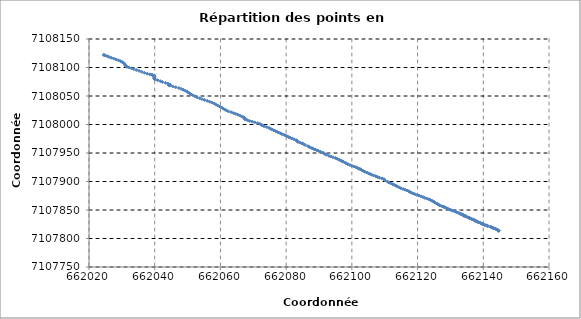
| Category | Series 0 |
|---|---|
| 662144.72 | 7107813.421 |
| 662144.589 | 7107813.587 |
| 662144.468 | 7107814.347 |
| 662144.363 | 7107814.971 |
| 662144.279 | 7107815.497 |
| 662144.242 | 7107815.692 |
| 662143.858 | 7107816.616 |
| 662143.619 | 7107817.131 |
| 662143.411 | 7107817.743 |
| 662143.033 | 7107818.399 |
| 662142.864 | 7107818.65 |
| 662142.582 | 7107819.428 |
| 662142.484 | 7107819.909 |
| 662142.165 | 7107820.459 |
| 662141.415 | 7107821.854 |
| 662141.141 | 7107822.362 |
| 662141.142 | 7107822.533 |
| 662140.944 | 7107823.171 |
| 662140.449 | 7107823.655 |
| 662140.347 | 7107823.924 |
| 662140.406 | 7107823.965 |
| 662139.985 | 7107824.959 |
| 662139.723 | 7107825.302 |
| 662139.679 | 7107825.713 |
| 662139.56 | 7107825.91 |
| 662139.218 | 7107826.692 |
| 662139.123 | 7107827.306 |
| 662138.78 | 7107828.016 |
| 662138.491 | 7107828.572 |
| 662138.286 | 7107829.259 |
| 662137.959 | 7107830.141 |
| 662137.838 | 7107830.233 |
| 662137.531 | 7107831.128 |
| 662137.592 | 7107831.453 |
| 662137.214 | 7107832.272 |
| 662137.099 | 7107832.781 |
| 662136.95 | 7107833.123 |
| 662136.736 | 7107833.39 |
| 662136.828 | 7107833.522 |
| 662136.846 | 7107833.548 |
| 662136.422 | 7107834.111 |
| 662136.102 | 7107835.138 |
| 662135.969 | 7107835.414 |
| 662135.764 | 7107835.947 |
| 662135.708 | 7107836.12 |
| 662135.402 | 7107836.805 |
| 662135.237 | 7107837.252 |
| 662134.882 | 7107838.215 |
| 662134.617 | 7107839.011 |
| 662134.61 | 7107839.153 |
| 662134.408 | 7107839.426 |
| 662134.126 | 7107839.888 |
| 662134.097 | 7107840.545 |
| 662133.874 | 7107840.899 |
| 662133.838 | 7107841.323 |
| 662133.776 | 7107841.551 |
| 662133.596 | 7107842.154 |
| 662133.487 | 7107842.372 |
| 662133.234 | 7107842.679 |
| 662132.928 | 7107843.399 |
| 662132.627 | 7107844.455 |
| 662132.183 | 7107845.5 |
| 662131.741 | 7107846.496 |
| 662131.255 | 7107847.697 |
| 662130.715 | 7107848.689 |
| 662130.211 | 7107849.768 |
| 662129.801 | 7107850.824 |
| 662129.353 | 7107851.791 |
| 662128.903 | 7107852.973 |
| 662128.476 | 7107854.177 |
| 662127.993 | 7107855.524 |
| 662128.004 | 7107855.539 |
| 662127.451 | 7107856.6 |
| 662126.843 | 7107857.712 |
| 662126.537 | 7107858.938 |
| 662126.195 | 7107860.165 |
| 662125.869 | 7107861.283 |
| 662125.423 | 7107862.621 |
| 662125.089 | 7107863.879 |
| 662124.762 | 7107864.995 |
| 662124.407 | 7107866.245 |
| 662123.909 | 7107867.487 |
| 662123.383 | 7107868.869 |
| 662122.776 | 7107870.124 |
| 662122.176 | 7107871.426 |
| 662121.656 | 7107872.717 |
| 662121.052 | 7107874.025 |
| 662120.447 | 7107875.222 |
| 662119.841 | 7107876.371 |
| 662119.205 | 7107877.647 |
| 662118.699 | 7107878.93 |
| 662118.187 | 7107880.25 |
| 662117.701 | 7107881.54 |
| 662117.292 | 7107882.884 |
| 662116.827 | 7107884.221 |
| 662116.234 | 7107885.535 |
| 662115.58 | 7107886.813 |
| 662114.891 | 7107888.176 |
| 662114.414 | 7107889.559 |
| 662113.912 | 7107891.027 |
| 662113.458 | 7107892.489 |
| 662112.932 | 7107893.971 |
| 662112.399 | 7107895.39 |
| 662111.803 | 7107896.785 |
| 662111.282 | 7107898.233 |
| 662110.908 | 7107899.641 |
| 662110.159 | 7107901.668 |
| 662109.768 | 7107904.224 |
| 662109.118 | 7107905.478 |
| 662108.44 | 7107906.661 |
| 662107.83 | 7107907.945 |
| 662107.262 | 7107909.251 |
| 662106.628 | 7107910.486 |
| 662106.071 | 7107911.777 |
| 662105.59 | 7107912.984 |
| 662105.057 | 7107914.377 |
| 662104.571 | 7107915.655 |
| 662103.975 | 7107917.018 |
| 662103.477 | 7107918.492 |
| 662102.943 | 7107920.049 |
| 662102.677 | 7107921.268 |
| 662102.615 | 7107921.415 |
| 662102.269 | 7107922.275 |
| 662101.718 | 7107923.665 |
| 662101.213 | 7107925.004 |
| 662100.601 | 7107926.357 |
| 662099.969 | 7107927.69 |
| 662099.377 | 7107928.996 |
| 662098.747 | 7107930.4 |
| 662098.239 | 7107931.906 |
| 662097.822 | 7107933.429 |
| 662097.355 | 7107934.886 |
| 662097.169 | 7107935.332 |
| 662096.935 | 7107935.817 |
| 662096.556 | 7107936.918 |
| 662096.085 | 7107938.258 |
| 662095.577 | 7107939.753 |
| 662094.973 | 7107941.154 |
| 662094.239 | 7107942.552 |
| 662093.588 | 7107943.905 |
| 662093.047 | 7107944.981 |
| 662092.246 | 7107946.897 |
| 662091.771 | 7107948.283 |
| 662091.363 | 7107949.741 |
| 662090.963 | 7107951.051 |
| 662090.368 | 7107952.399 |
| 662089.823 | 7107953.72 |
| 662089.271 | 7107954.994 |
| 662088.746 | 7107956.221 |
| 662088.352 | 7107957.201 |
| 662087.893 | 7107958.324 |
| 662087.399 | 7107959.407 |
| 662087.01 | 7107960.679 |
| 662086.625 | 7107962.017 |
| 662085.751 | 7107964.016 |
| 662085.258 | 7107965.828 |
| 662084.796 | 7107966.939 |
| 662084.21 | 7107968.116 |
| 662083.592 | 7107969.368 |
| 662083.385 | 7107970.813 |
| 662083.196 | 7107971.982 |
| 662083.05 | 7107972.49 |
| 662082.352 | 7107974.246 |
| 662081.731 | 7107975.63 |
| 662081.208 | 7107976.82 |
| 662080.741 | 7107978.166 |
| 662080.188 | 7107979.544 |
| 662079.718 | 7107980.996 |
| 662079.206 | 7107982.235 |
| 662078.634 | 7107983.406 |
| 662078.232 | 7107984.591 |
| 662077.718 | 7107985.81 |
| 662077.291 | 7107987.083 |
| 662076.817 | 7107988.393 |
| 662076.224 | 7107989.77 |
| 662075.797 | 7107991.011 |
| 662075.306 | 7107992.43 |
| 662074.798 | 7107994.044 |
| 662074.082 | 7107995.515 |
| 662073.265 | 7107996.94 |
| 662072.765 | 7107998.361 |
| 662072.469 | 7107999.703 |
| 662072.045 | 7108001.115 |
| 662071.341 | 7108002.417 |
| 662070.416 | 7108003.708 |
| 662069.659 | 7108005.135 |
| 662068.827 | 7108006.374 |
| 662068.136 | 7108007.688 |
| 662067.506 | 7108008.945 |
| 662067.482 | 7108010.051 |
| 662067.404 | 7108011.111 |
| 662067.024 | 7108012.464 |
| 662066.953 | 7108012.783 |
| 662066.389 | 7108014.294 |
| 662065.865 | 7108015.76 |
| 662065.298 | 7108017.273 |
| 662064.658 | 7108018.685 |
| 662063.937 | 7108020.086 |
| 662063.213 | 7108021.662 |
| 662062.376 | 7108023.217 |
| 662061.752 | 7108024.907 |
| 662061.226 | 7108026.441 |
| 662060.767 | 7108028.183 |
| 662060.325 | 7108029.864 |
| 662059.73 | 7108031.603 |
| 662059.161 | 7108033.308 |
| 662058.62 | 7108035.029 |
| 662058.144 | 7108036.715 |
| 662057.439 | 7108038.325 |
| 662056.724 | 7108039.958 |
| 662055.967 | 7108041.507 |
| 662055.157 | 7108043.069 |
| 662054.374 | 7108044.605 |
| 662053.669 | 7108046.087 |
| 662052.887 | 7108047.698 |
| 662052.304 | 7108049.329 |
| 662051.721 | 7108050.949 |
| 662051.182 | 7108052.487 |
| 662050.755 | 7108054.147 |
| 662050.313 | 7108055.768 |
| 662049.925 | 7108057.494 |
| 662049.362 | 7108059.177 |
| 662048.703 | 7108060.824 |
| 662048.057 | 7108062.462 |
| 662047.335 | 7108063.988 |
| 662046.408 | 7108065.428 |
| 662045.514 | 7108066.789 |
| 662044.646 | 7108068.108 |
| 662044.186 | 7108069.237 |
| 662044.637 | 7108069.941 |
| 662044.597 | 7108070.416 |
| 662044.038 | 7108071.594 |
| 662043.295 | 7108073.041 |
| 662042.341 | 7108074.512 |
| 662041.69 | 7108076.097 |
| 662040.907 | 7108077.611 |
| 662040.157 | 7108079 |
| 662039.83 | 7108080.403 |
| 662039.846 | 7108081.964 |
| 662039.978 | 7108083.408 |
| 662039.912 | 7108084.814 |
| 662039.558 | 7108086.038 |
| 662039.307 | 7108087.026 |
| 662038.956 | 7108087.431 |
| 662038.506 | 7108087.967 |
| 662037.71 | 7108089.137 |
| 662036.878 | 7108090.66 |
| 662036.063 | 7108092.325 |
| 662035.239 | 7108094.088 |
| 662034.402 | 7108095.715 |
| 662033.625 | 7108097.241 |
| 662032.869 | 7108098.641 |
| 662032.084 | 7108100.143 |
| 662031.556 | 7108101.216 |
| 662031.202 | 7108102.756 |
| 662030.984 | 7108104.429 |
| 662030.823 | 7108106.102 |
| 662030.555 | 7108107.842 |
| 662030.118 | 7108109.515 |
| 662029.597 | 7108111.049 |
| 662028.96 | 7108112.559 |
| 662028.258 | 7108114.095 |
| 662027.534 | 7108115.637 |
| 662026.809 | 7108117.114 |
| 662026.096 | 7108118.468 |
| 662025.56 | 7108119.76 |
| 662024.967 | 7108121.009 |
| 662024.665 | 7108121.823 |
| 662024.468 | 7108122.097 |